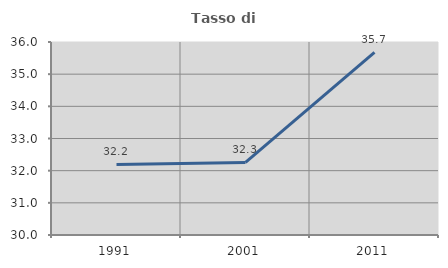
| Category | Tasso di occupazione   |
|---|---|
| 1991.0 | 32.195 |
| 2001.0 | 32.257 |
| 2011.0 | 35.676 |